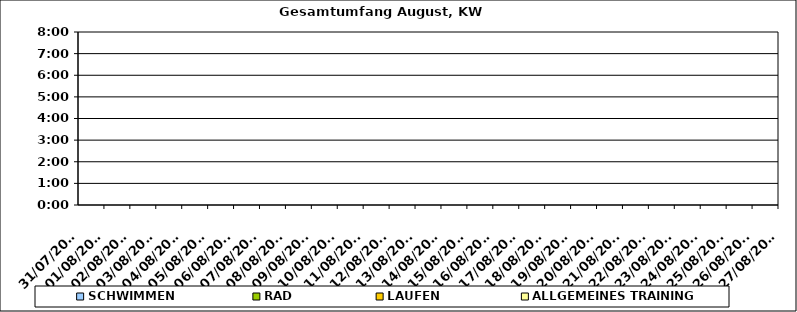
| Category | SCHWIMMEN | RAD | LAUFEN | ALLGEMEINES TRAINING |
|---|---|---|---|---|
| 31/07/2023 |  |  |  | 0 |
| 01/08/2023 |  |  |  | 0 |
| 02/08/2023 |  |  |  | 0 |
| 03/08/2023 |  |  |  | 0 |
| 04/08/2023 |  |  |  | 0 |
| 05/08/2023 |  |  |  | 0 |
| 06/08/2023 |  |  |  | 0 |
| 07/08/2023 |  |  |  | 0 |
| 08/08/2023 |  |  |  | 0 |
| 09/08/2023 |  |  |  | 0 |
| 10/08/2023 |  |  |  | 0 |
| 11/08/2023 |  |  |  | 0 |
| 12/08/2023 |  |  |  | 0 |
| 13/08/2023 |  |  |  | 0 |
| 14/08/2023 |  |  |  | 0 |
| 15/08/2023 |  |  |  | 0 |
| 16/08/2023 |  |  |  | 0 |
| 17/08/2023 |  |  |  | 0 |
| 18/08/2023 |  |  |  | 0 |
| 19/08/2023 |  |  |  | 0 |
| 20/08/2023 |  |  |  | 0 |
| 21/08/2023 |  |  |  | 0 |
| 22/08/2023 |  |  |  | 0 |
| 23/08/2023 |  |  |  | 0 |
| 24/08/2023 |  |  |  | 0 |
| 25/08/2023 |  |  |  | 0 |
| 26/08/2023 |  |  |  | 0 |
| 27/08/2023 |  |  |  | 0 |